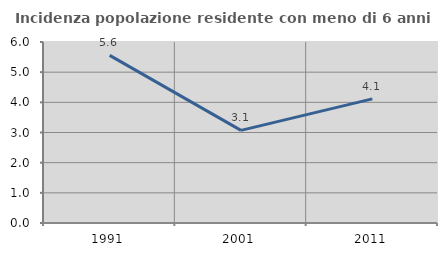
| Category | Incidenza popolazione residente con meno di 6 anni |
|---|---|
| 1991.0 | 5.556 |
| 2001.0 | 3.07 |
| 2011.0 | 4.115 |